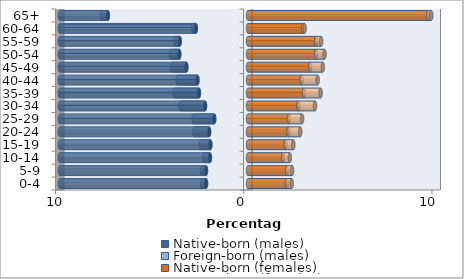
| Category | Native-born (males) | Foreign-born (males) | Native-born (females) | Foreign-born (females) |
|---|---|---|---|---|
| 0-4 | -2.229 | -0.204 | 2.067 | 0.251 |
| 5-9 | -2.232 | -0.213 | 2.073 | 0.27 |
| 10-14 | -2.022 | -0.293 | 1.863 | 0.359 |
| 15-19 | -2 | -0.499 | 1.984 | 0.423 |
| 20-24 | -2.067 | -0.776 | 2.153 | 0.623 |
| 25-29 | -1.797 | -1.094 | 2.175 | 0.7 |
| 30-34 | -2.283 | -1.294 | 2.681 | 0.881 |
| 35-39 | -2.607 | -1.281 | 2.976 | 0.881 |
| 40-44 | -2.687 | -1.043 | 2.846 | 0.852 |
| 45-49 | -3.275 | -0.744 | 3.307 | 0.668 |
| 50-54 | -3.65 | -0.445 | 3.615 | 0.452 |
| 55-59 | -3.628 | -0.235 | 3.622 | 0.267 |
| 60-64 | -2.77 | -0.137 | 2.929 | 0.079 |
| 65+ | -7.444 | -0.315 | 9.571 | 0.165 |